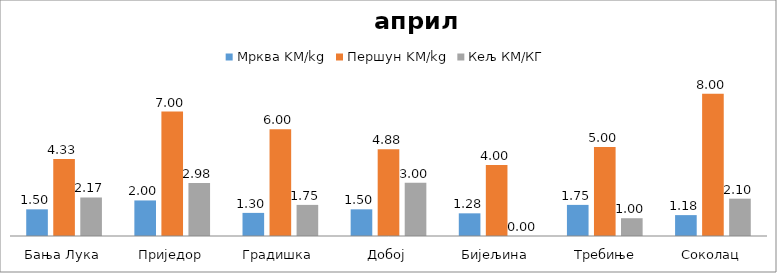
| Category | Мрква KM/kg | Першун KM/kg | Кељ КМ/КГ |
|---|---|---|---|
| Бања Лука | 1.5 | 4.333 | 2.167 |
| Приједор | 2 | 7 | 2.975 |
| Градишка | 1.3 | 6 | 1.75 |
| Добој | 1.5 | 4.875 | 3 |
| Бијељина | 1.275 | 4 | 0 |
|  Требиње | 1.75 | 5 | 1 |
| Соколац | 1.175 | 8 | 2.1 |